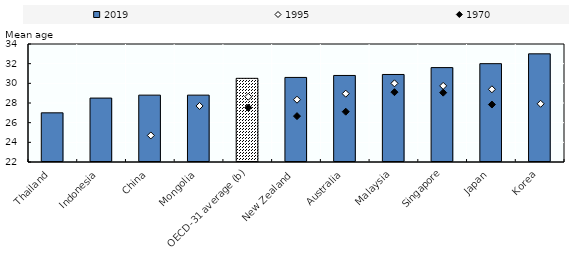
| Category | 2019 |
|---|---|
| Thailand | 27 |
| Indonesia | 28.5 |
| China | 28.8 |
| Mongolia | 28.8 |
| OECD-31 average (b) | 30.508 |
| New Zealand | 30.6 |
| Australia | 30.8 |
| Malaysia | 30.9 |
| Singapore | 31.6 |
| Japan | 32 |
| Korea | 33 |